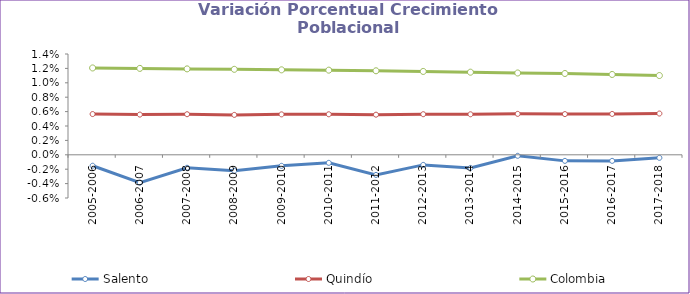
| Category | Salento | Quindío | Colombia |
|---|---|---|---|
| 2005-2006 | -0.002 | 0.006 | 0.012 |
| 2006-2007 | -0.004 | 0.006 | 0.012 |
| 2007-2008 | -0.002 | 0.006 | 0.012 |
| 2008-2009 | -0.002 | 0.006 | 0.012 |
| 2009-2010 | -0.002 | 0.006 | 0.012 |
| 2010-2011 | -0.001 | 0.006 | 0.012 |
| 2011-2012 | -0.003 | 0.006 | 0.012 |
| 2012-2013 | -0.001 | 0.006 | 0.012 |
| 2013-2014 | -0.002 | 0.006 | 0.011 |
| 2014-2015 | 0 | 0.006 | 0.011 |
| 2015-2016 | -0.001 | 0.006 | 0.011 |
| 2016-2017 | -0.001 | 0.006 | 0.011 |
| 2017-2018 | 0 | 0.006 | 0.011 |